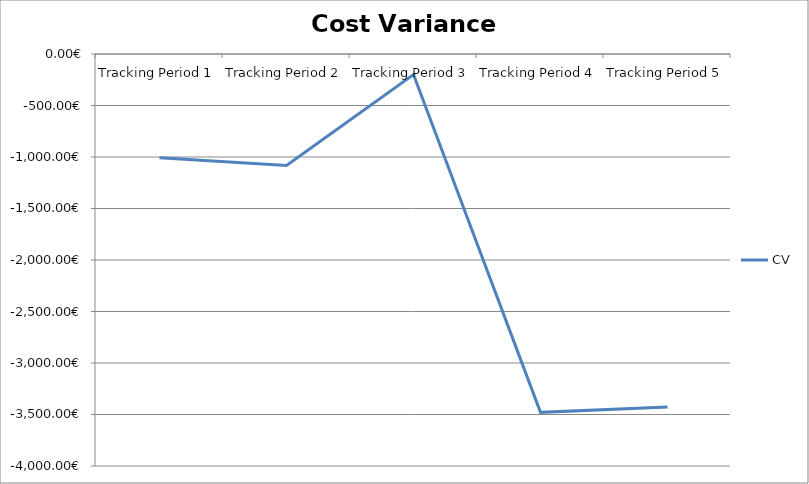
| Category | CV |
|---|---|
| Tracking Period 1 | -1007 |
| Tracking Period 2 | -1082 |
| Tracking Period 3 | -199 |
| Tracking Period 4 | -3479 |
| Tracking Period 5 | -3427 |